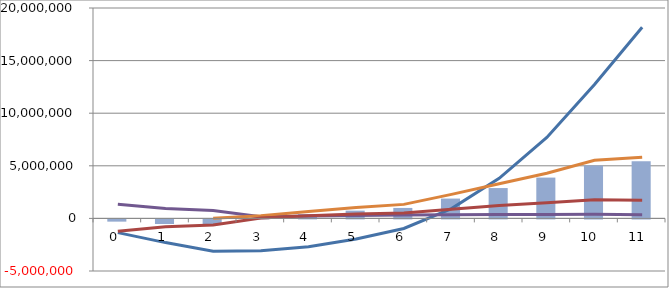
| Category | 0  |
|---|---|
| 0.0 | -212790.698 |
| 1.0 | -437209.302 |
| 2.0 | -526250 |
| 3.0 | 45270 |
| 4.0 | 395427.5 |
| 5.0 | 736003 |
| 6.0 | 994786.55 |
| 7.0 | 1885148.695 |
| 8.0 | 2884160.826 |
| 9.0 | 3879716.743 |
| 10.0 | 5031609.569 |
| 11.0 | 5438828.112 |